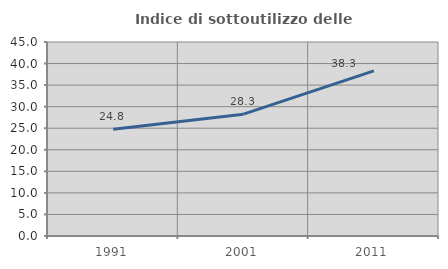
| Category | Indice di sottoutilizzo delle abitazioni  |
|---|---|
| 1991.0 | 24.777 |
| 2001.0 | 28.256 |
| 2011.0 | 38.32 |